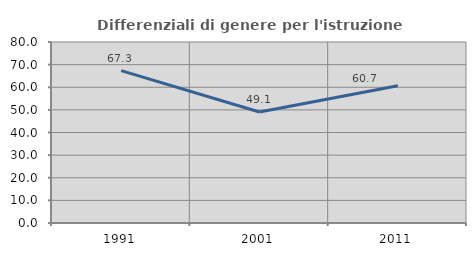
| Category | Differenziali di genere per l'istruzione superiore |
|---|---|
| 1991.0 | 67.33 |
| 2001.0 | 49.073 |
| 2011.0 | 60.684 |